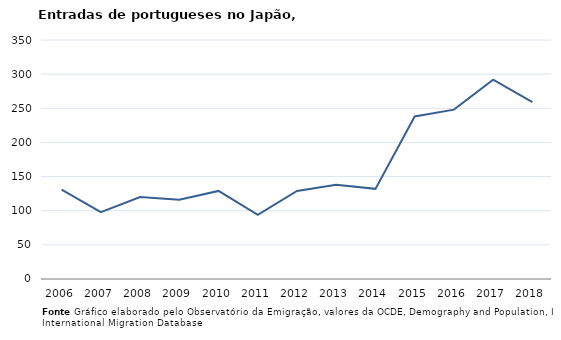
| Category | Entradas |
|---|---|
| 2006.0 | 131 |
| 2007.0 | 98 |
| 2008.0 | 120 |
| 2009.0 | 116 |
| 2010.0 | 129 |
| 2011.0 | 94 |
| 2012.0 | 129 |
| 2013.0 | 138 |
| 2014.0 | 132 |
| 2015.0 | 238 |
| 2016.0 | 248 |
| 2017.0 | 292 |
| 2018.0 | 259 |